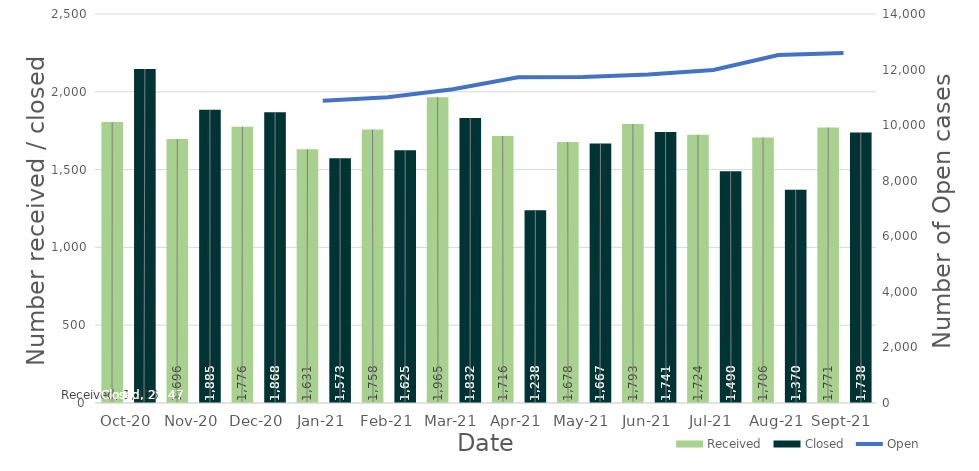
| Category | Received | Closed |
|---|---|---|
| 2020-10-01 | 1806 | 2147 |
| 2020-11-01 | 1696 | 1885 |
| 2020-12-01 | 1776 | 1868 |
| 2021-01-01 | 1631 | 1573 |
| 2021-02-01 | 1758 | 1625 |
| 2021-03-01 | 1965 | 1832 |
| 2021-04-01 | 1716 | 1238 |
| 2021-05-01 | 1678 | 1667 |
| 2021-06-01 | 1793 | 1741 |
| 2021-07-01 | 1724 | 1490 |
| 2021-08-01 | 1706 | 1370 |
| 2021-09-01 | 1771 | 1738 |